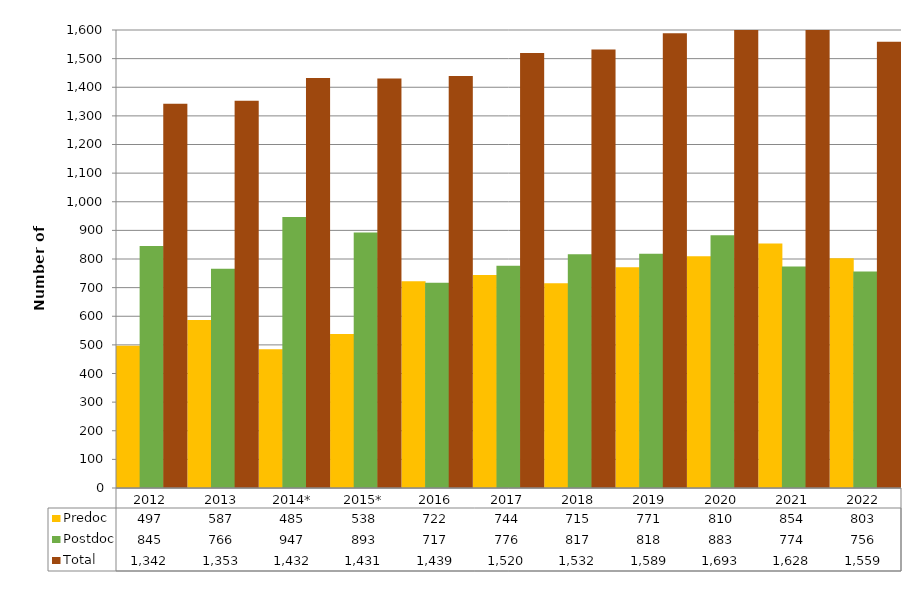
| Category | Predoc | Postdoc | Total |
|---|---|---|---|
| 2012 | 497 | 845 | 1342 |
| 2013 | 587 | 766 | 1353 |
| 2014* | 485 | 947 | 1432 |
| 2015* | 538 | 893 | 1431 |
| 2016 | 722 | 717 | 1439 |
| 2017 | 744 | 776 | 1520 |
| 2018 | 715 | 817 | 1532 |
| 2019 | 771 | 818 | 1589 |
| 2020 | 810 | 883 | 1693 |
| 2021 | 854 | 774 | 1628 |
| 2022 | 803 | 756 | 1559 |